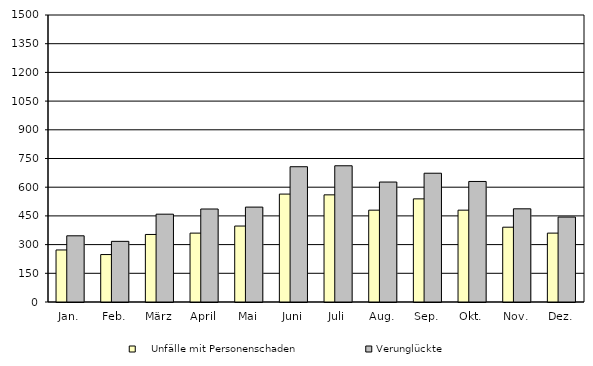
| Category |     Unfälle mit Personenschaden | Verunglückte |
|---|---|---|
| Jan. | 272 | 346 |
| Feb. | 248 | 317 |
| März | 353 | 459 |
| April | 360 | 486 |
| Mai | 397 | 496 |
| Juni | 564 | 707 |
| Juli | 560 | 712 |
| Aug. | 480 | 627 |
| Sep. | 539 | 673 |
| Okt. | 480 | 630 |
| Nov. | 391 | 487 |
| Dez. | 360 | 444 |